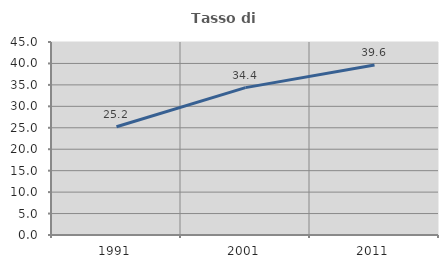
| Category | Tasso di occupazione   |
|---|---|
| 1991.0 | 25.23 |
| 2001.0 | 34.364 |
| 2011.0 | 39.614 |